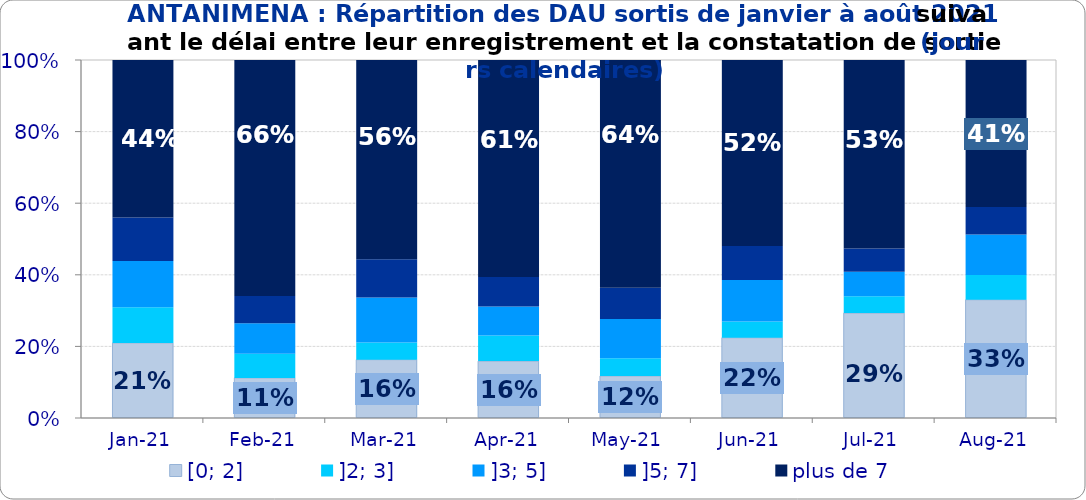
| Category | [0; 2] | ]2; 3] | ]3; 5] | ]5; 7] | plus de 7 |
|---|---|---|---|---|---|
| 2021-01-01 | 0.21 | 0.1 | 0.129 | 0.122 | 0.44 |
| 2021-02-01 | 0.112 | 0.068 | 0.085 | 0.076 | 0.659 |
| 2021-03-01 | 0.163 | 0.048 | 0.126 | 0.106 | 0.557 |
| 2021-04-01 | 0.159 | 0.072 | 0.081 | 0.082 | 0.606 |
| 2021-05-01 | 0.117 | 0.05 | 0.11 | 0.087 | 0.636 |
| 2021-06-01 | 0.224 | 0.046 | 0.115 | 0.096 | 0.519 |
| 2021-07-01 | 0.293 | 0.047 | 0.069 | 0.065 | 0.527 |
| 2021-08-01 | 0.33 | 0.069 | 0.113 | 0.077 | 0.411 |